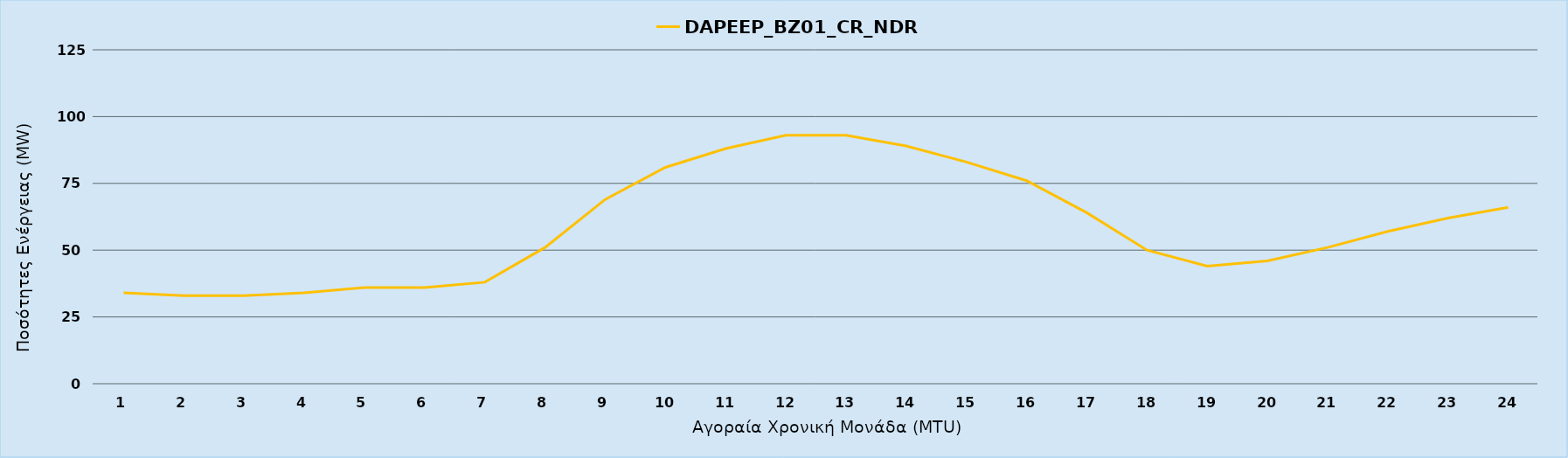
| Category | DAPEEP_BZ01_CR_NDR |
|---|---|
| 0 | 34 |
| 1 | 33 |
| 2 | 33 |
| 3 | 34 |
| 4 | 36 |
| 5 | 36 |
| 6 | 38 |
| 7 | 51 |
| 8 | 69 |
| 9 | 81 |
| 10 | 88 |
| 11 | 93 |
| 12 | 93 |
| 13 | 89 |
| 14 | 83 |
| 15 | 76 |
| 16 | 64 |
| 17 | 50 |
| 18 | 44 |
| 19 | 46 |
| 20 | 51 |
| 21 | 57 |
| 22 | 62 |
| 23 | 66 |